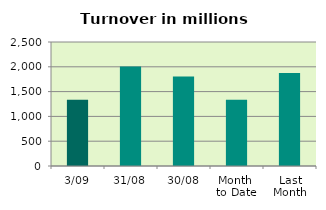
| Category | Series 0 |
|---|---|
| 3/09 | 1333.337 |
| 31/08 | 2007.638 |
| 30/08 | 1804.775 |
| Month 
to Date | 1333.337 |
| Last
Month | 1877.423 |